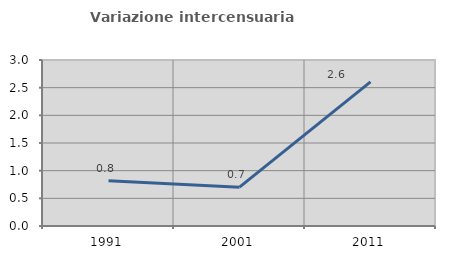
| Category | Variazione intercensuaria annua |
|---|---|
| 1991.0 | 0.819 |
| 2001.0 | 0.701 |
| 2011.0 | 2.606 |